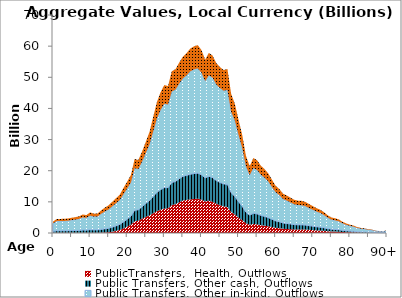
| Category | PublicTransfers,  Health, Outflows | Public Transfers, Other cash, Outflows | Public Transfers, Other in-kind, Outflows | Public Transfers, Education, Outflows |
|---|---|---|---|---|
| 0 | 54.718 | 525.534 | 2528.047 | 560.304 |
|  | 67.393 | 647.264 | 3113.623 | 690.088 |
| 2 | 67.411 | 647.438 | 3114.457 | 690.273 |
| 3 | 68.141 | 654.449 | 3148.185 | 697.749 |
| 4 | 69.463 | 667.147 | 3209.268 | 711.287 |
| 5 | 73.126 | 702.33 | 3378.512 | 748.797 |
| 6 | 75.739 | 727.424 | 3499.227 | 775.552 |
| 7 | 79.788 | 766.317 | 3686.319 | 817.018 |
| 8 | 88.495 | 849.942 | 4088.595 | 906.176 |
| 9 | 85.942 | 825.416 | 3970.614 | 880.028 |
| 10 | 98.558 | 946.582 | 4553.473 | 1009.21 |
| 11 | 92.805 | 890.231 | 4282.399 | 949.13 |
| 12 | 95.69 | 893.816 | 4299.305 | 952.877 |
| 13 | 119.118 | 1042.472 | 5009.755 | 1110.338 |
| 14 | 169.027 | 1171.237 | 5604.235 | 1242.096 |
| 15 | 257.753 | 1273.24 | 6037.654 | 1338.156 |
| 16 | 427.64 | 1439.537 | 6712.757 | 1487.783 |
| 17 | 688.133 | 1603.587 | 7284.051 | 1614.402 |
| 18 | 994.21 | 1776.831 | 7829.322 | 1735.253 |
| 19 | 1469.021 | 2105.224 | 8935.92 | 1980.514 |
| 20 | 2039.809 | 2425.561 | 9861.53 | 2185.662 |
| 21 | 2677.65 | 2762.794 | 10822.862 | 2398.727 |
| 22 | 3760.291 | 3538.497 | 13484.951 | 2988.739 |
| 23 | 3953.435 | 3495.819 | 13098.758 | 2903.146 |
| 24 | 4569.424 | 3882.042 | 14483.79 | 3210.117 |
| 25 | 5159.872 | 4319.488 | 16204.701 | 3591.532 |
| 26 | 5659.376 | 4751.849 | 18039.78 | 3998.25 |
| 27 | 6338.1 | 5399.003 | 20864.173 | 4624.235 |
| 28 | 7013.057 | 6045.975 | 23724.983 | 5258.291 |
| 29 | 7465.442 | 6459.088 | 25627.368 | 5679.926 |
| 30 | 7848.555 | 6735.586 | 26956.992 | 5974.618 |
| 31 | 7925.046 | 6634.883 | 26689.41 | 5915.312 |
| 32 | 8956.099 | 7253.291 | 29243.5 | 6481.388 |
| 33 | 9250.192 | 7297.194 | 29490.286 | 6536.085 |
| 34 | 9875.192 | 7541.339 | 30534.343 | 6767.485 |
| 35 | 10432.273 | 7757.678 | 31471.078 | 6975.098 |
| 36 | 10627.925 | 7883.013 | 32146.429 | 7124.78 |
| 37 | 10789.855 | 8060.395 | 33058.703 | 7326.972 |
| 38 | 10936.48 | 8147.505 | 33453.889 | 7414.559 |
| 39 | 11007.704 | 8195.221 | 33664.785 | 7461.301 |
| 40 | 10730.216 | 7970.28 | 32801.752 | 7270.022 |
| 41 | 10147.645 | 7541.54 | 31098.771 | 6892.582 |
| 42 | 10370.043 | 7841.026 | 32429.363 | 7187.488 |
| 43 | 10029.514 | 7748.014 | 32097.63 | 7113.964 |
| 44 | 9403.428 | 7442.578 | 30861.232 | 6839.935 |
| 45 | 8926.773 | 7298.552 | 30325.129 | 6721.115 |
| 46 | 8547.735 | 7198.687 | 29934.959 | 6634.64 |
| 47 | 8344.796 | 7285.478 | 30329.802 | 6722.151 |
| 48 | 6746.596 | 6219.248 | 25984.21 | 5759.015 |
| 49 | 5953.165 | 5807.034 | 24333.907 | 5393.25 |
| 50 | 4944.503 | 5109.857 | 21468.282 | 4758.126 |
| 51 | 4107.83 | 4446.165 | 18698.289 | 4144.199 |
| 52 | 3137.756 | 3518.369 | 14782.54 | 3276.331 |
| 53 | 2654.279 | 3071.094 | 12894.886 | 2857.96 |
| 54 | 2908.745 | 3456.451 | 14494.144 | 3212.412 |
| 55 | 2766.011 | 3368.018 | 14100.526 | 3125.173 |
| 56 | 2519.499 | 3131.648 | 13078.365 | 2898.626 |
| 57 | 2355.288 | 2982.151 | 12424.795 | 2753.772 |
| 58 | 2169.51 | 2792.486 | 11610.063 | 2573.198 |
| 59 | 1907.261 | 2504.014 | 10395.403 | 2303.987 |
| 60 | 1658.279 | 2223.384 | 9217.774 | 2042.983 |
| 61 | 1521.838 | 2076.116 | 8598.063 | 1905.633 |
| 62 | 1348.043 | 1859.843 | 7702.989 | 1707.253 |
| 63 | 1281.013 | 1772.67 | 7360.41 | 1631.326 |
| 64 | 1206.619 | 1664.09 | 6939.981 | 1538.144 |
| 65 | 1139.981 | 1558.68 | 6529.499 | 1447.167 |
| 66 | 1114.839 | 1510.212 | 6350.968 | 1407.598 |
| 67 | 1117.586 | 1495.441 | 6310.13 | 1398.547 |
| 68 | 1089.071 | 1442.926 | 6103.266 | 1352.698 |
| 69 | 1010.124 | 1336.624 | 5663.542 | 1255.24 |
| 70 | 935.659 | 1249.41 | 5296.428 | 1173.875 |
| 71 | 846.496 | 1154.384 | 4902.135 | 1086.486 |
| 72 | 783.044 | 1081.422 | 4597.101 | 1018.879 |
| 73 | 696.513 | 970.74 | 4125.905 | 914.446 |
| 74 | 582.332 | 830.232 | 3528.709 | 782.086 |
| 75 | 494.048 | 728.656 | 3095.349 | 686.038 |
| 76 | 452.561 | 692.021 | 2936.708 | 650.878 |
| 77 | 402.185 | 641.377 | 2721.008 | 603.071 |
| 78 | 317.917 | 532.626 | 2260.242 | 500.949 |
| 79 | 257.698 | 454.679 | 1929.783 | 427.708 |
| 80 | 214.882 | 398.5 | 1691.238 | 374.838 |
| 81 | 184.277 | 354.496 | 1500.216 | 332.501 |
| 82 | 141.139 | 283.002 | 1193.298 | 264.477 |
| 83 | 117.682 | 247.405 | 1039.667 | 230.427 |
| 84 | 99.96 | 220.576 | 924.001 | 204.791 |
| 85 | 79.069 | 183.951 | 767.411 | 170.085 |
| 86 | 66.65 | 164.052 | 681.322 | 151.005 |
| 87 | 42.113 | 110.184 | 455.32 | 100.915 |
| 88 | 30.429 | 85.191 | 350.064 | 77.587 |
| 89 | 21.382 | 64.656 | 263.987 | 58.509 |
| 90+ | 52.105 | 172.134 | 697.06 | 154.493 |